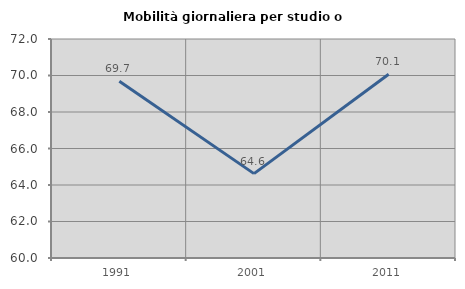
| Category | Mobilità giornaliera per studio o lavoro |
|---|---|
| 1991.0 | 69.679 |
| 2001.0 | 64.623 |
| 2011.0 | 70.071 |